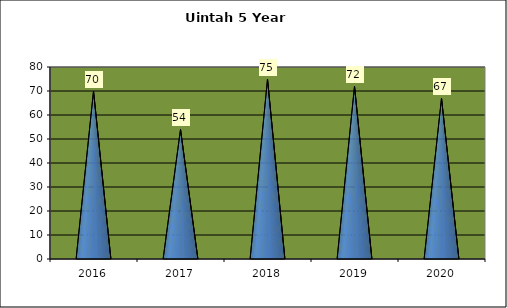
| Category | Washington Terrace April Comparison |
|---|---|
| 0 | 70 |
| 1 | 54 |
| 2 | 75 |
| 3 | 72 |
| 4 | 67 |